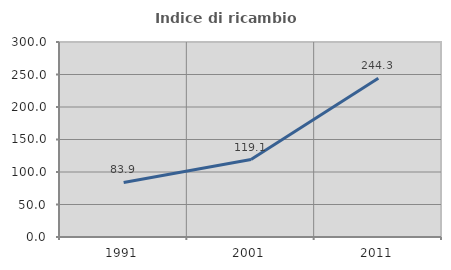
| Category | Indice di ricambio occupazionale  |
|---|---|
| 1991.0 | 83.886 |
| 2001.0 | 119.094 |
| 2011.0 | 244.302 |